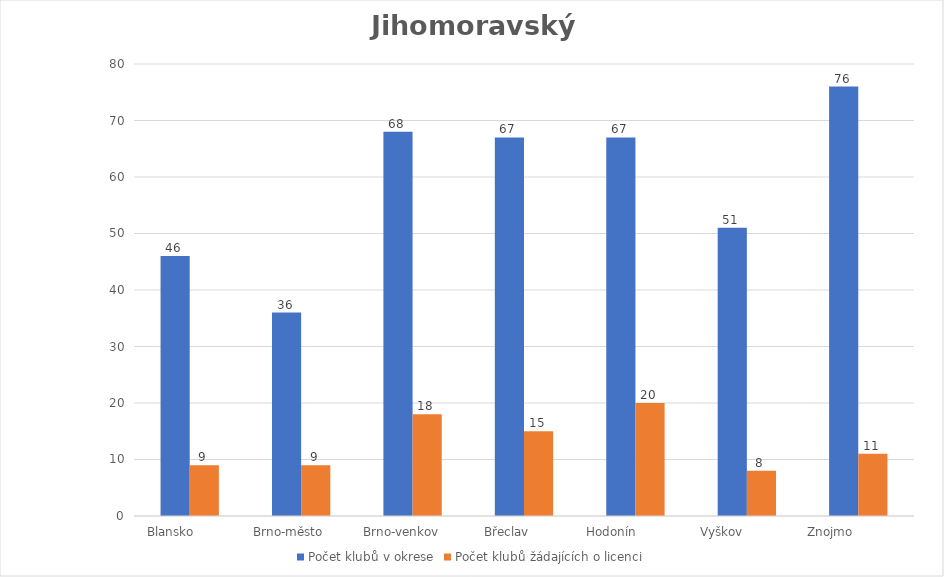
| Category | Počet klubů v okrese | Počet klubů žádajících o licenci |
|---|---|---|
| Blansko          | 46 | 9 |
| Brno-město       | 36 | 9 |
| Brno-venkov      | 68 | 18 |
| Břeclav         | 67 | 15 |
| Hodonín             | 67 | 20 |
| Vyškov             | 51 | 8 |
| Znojmo               | 76 | 11 |